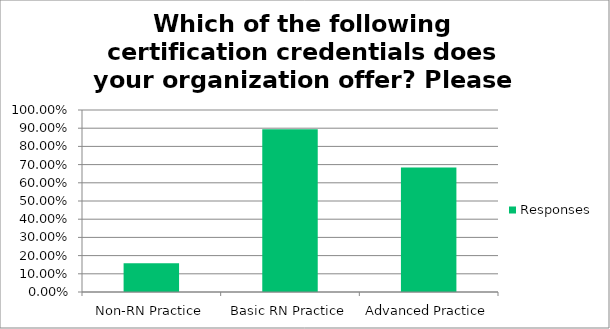
| Category | Responses |
|---|---|
| Non-RN Practice | 0.158 |
| Basic RN Practice | 0.895 |
| Advanced Practice | 0.684 |